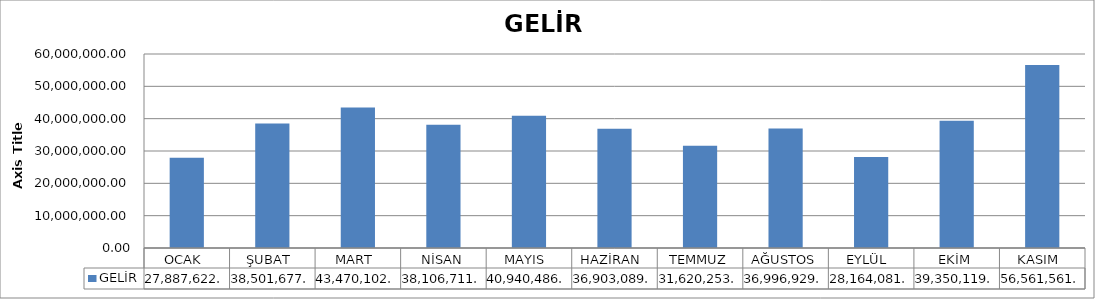
| Category | GELİR  |
|---|---|
| OCAK  | 27887622.86 |
| ŞUBAT  | 38501677 |
| MART  | 43470102.6 |
| NİSAN | 38106711.2 |
| MAYIS  | 40940486.11 |
| HAZİRAN  | 36903089.32 |
| TEMMUZ | 31620253.79 |
| AĞUSTOS | 36996929.41 |
| EYLÜL  | 28164081.77 |
| EKİM | 39350119.29 |
| KASIM  | 56561561.87 |